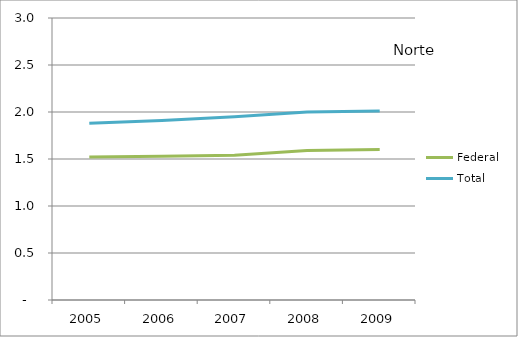
| Category | Federal | Total |
|---|---|---|
| 2005.0 | 1.52 | 1.88 |
| 2006.0 | 1.53 | 1.91 |
| 2007.0 | 1.54 | 1.95 |
| 2008.0 | 1.59 | 2 |
| 2009.0 | 1.6 | 2.01 |